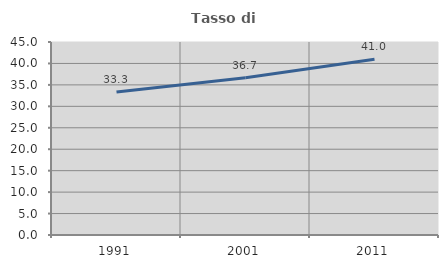
| Category | Tasso di occupazione   |
|---|---|
| 1991.0 | 33.333 |
| 2001.0 | 36.677 |
| 2011.0 | 40.988 |